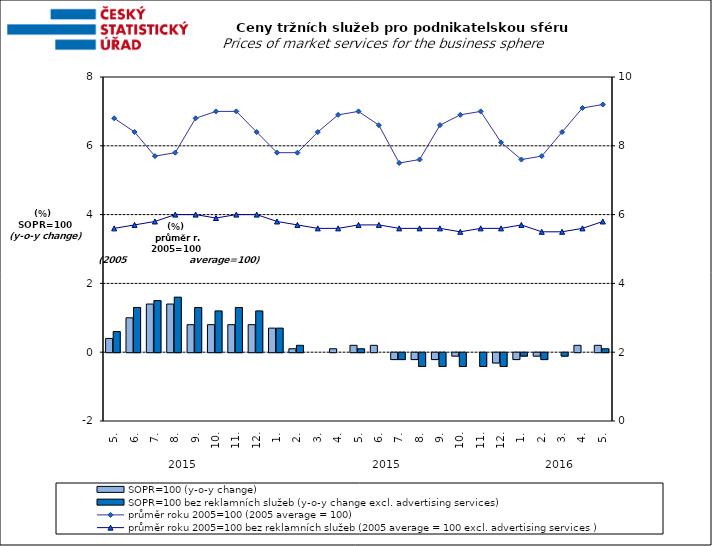
| Category | SOPR=100 (y-o-y change)   | SOPR=100 bez reklamních služeb (y-o-y change excl. advertising services)   |
|---|---|---|
| 0 | 0.4 | 0.6 |
| 1 | 1 | 1.3 |
| 2 | 1.4 | 1.5 |
| 3 | 1.4 | 1.6 |
| 4 | 0.8 | 1.3 |
| 5 | 0.8 | 1.2 |
| 6 | 0.8 | 1.3 |
| 7 | 0.8 | 1.2 |
| 8 | 0.7 | 0.7 |
| 9 | 0.1 | 0.2 |
| 10 | 0 | 0 |
| 11 | 0.1 | 0 |
| 12 | 0.2 | 0.1 |
| 13 | 0.2 | 0 |
| 14 | -0.2 | -0.2 |
| 15 | -0.2 | -0.4 |
| 16 | -0.2 | -0.4 |
| 17 | -0.1 | -0.4 |
| 18 | 0 | -0.4 |
| 19 | -0.3 | -0.4 |
| 20 | -0.2 | -0.1 |
| 21 | -0.1 | -0.2 |
| 22 | 0 | -0.1 |
| 23 | 0.2 | 0 |
| 24 | 0.2 | 0.1 |